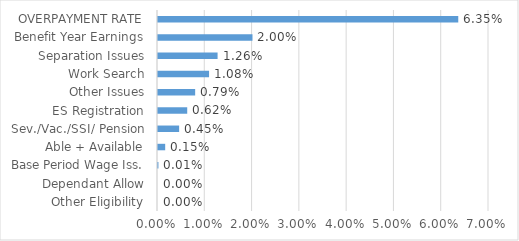
| Category | Series 0 |
|---|---|
| Other Eligibility | 0 |
| Dependant Allow | 0 |
| Base Period Wage Iss. | 0 |
| Able + Available | 0.002 |
| Sev./Vac./SSI/ Pension | 0.004 |
| ES Registration | 0.006 |
| Other Issues | 0.008 |
| Work Search | 0.011 |
| Separation Issues | 0.013 |
| Benefit Year Earnings | 0.02 |
| OVERPAYMENT RATE | 0.064 |